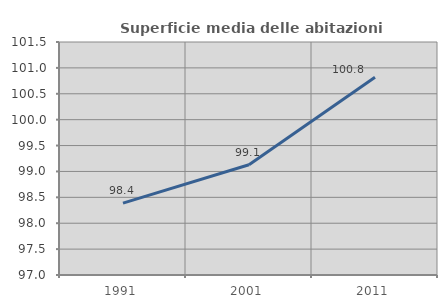
| Category | Superficie media delle abitazioni occupate |
|---|---|
| 1991.0 | 98.388 |
| 2001.0 | 99.129 |
| 2011.0 | 100.819 |